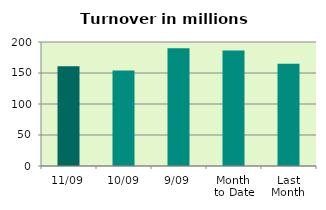
| Category | Series 0 |
|---|---|
| 11/09 | 161.058 |
| 10/09 | 153.934 |
| 9/09 | 189.802 |
| Month 
to Date | 186.44 |
| Last
Month | 165.075 |